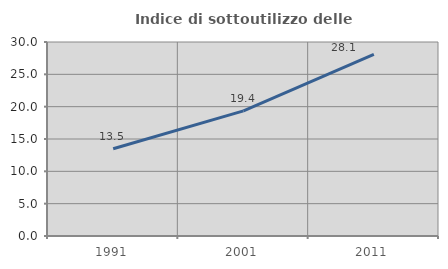
| Category | Indice di sottoutilizzo delle abitazioni  |
|---|---|
| 1991.0 | 13.487 |
| 2001.0 | 19.355 |
| 2011.0 | 28.095 |